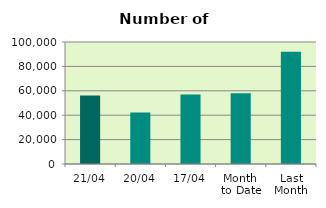
| Category | Series 0 |
|---|---|
| 21/04 | 56182 |
| 20/04 | 42202 |
| 17/04 | 56970 |
| Month 
to Date | 58015.846 |
| Last
Month | 92104.455 |